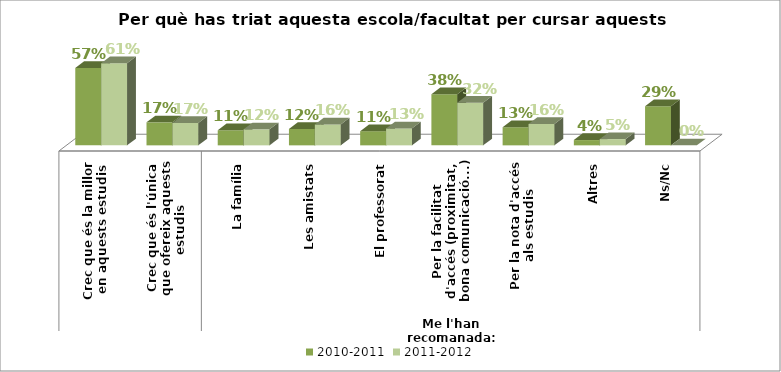
| Category | 2010-2011 | 2011-2012 |
|---|---|---|
| 0 | 0.575 | 0.61 |
| 1 | 0.171 | 0.166 |
| 2 | 0.112 | 0.119 |
| 3 | 0.122 | 0.155 |
| 4 | 0.105 | 0.126 |
| 5 | 0.379 | 0.316 |
| 6 | 0.135 | 0.159 |
| 7 | 0.039 | 0.046 |
| 8 | 0.291 | 0 |